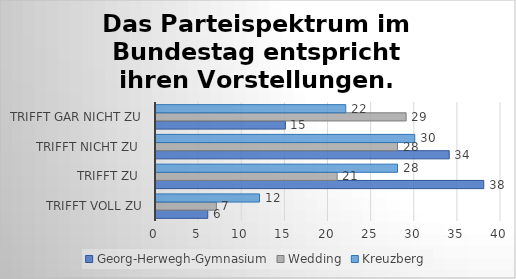
| Category | Georg-Herwegh-Gymnasium | Wedding | Kreuzberg |
|---|---|---|---|
| trifft voll zu | 6 | 7 | 12 |
| trifft zu  | 38 | 21 | 28 |
| trifft nicht zu  | 34 | 28 | 30 |
| trifft gar nicht zu | 15 | 29 | 22 |